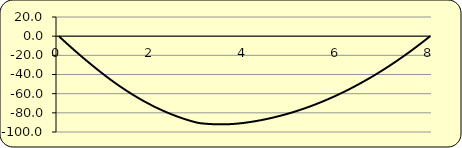
| Category | moment |
|---|---|
| 0.0 | 0 |
| 0.08 | -3.597 |
| 0.16 | -7.141 |
| 0.24 | -10.634 |
| 0.32 | -14.074 |
| 0.4 | -17.463 |
| 0.48000000000000004 | -20.8 |
| 0.56 | -24.085 |
| 0.64 | -27.318 |
| 0.72 | -30.499 |
| 0.7999999999999999 | -33.628 |
| 0.8799999999999999 | -36.706 |
| 0.9599999999999999 | -39.731 |
| 1.0399999999999998 | -42.701 |
| 1.1199999999999999 | -45.594 |
| 1.2 | -48.407 |
| 1.28 | -51.14 |
| 1.36 | -53.793 |
| 1.4400000000000002 | -56.366 |
| 1.5200000000000002 | -58.859 |
| 1.6000000000000003 | -61.272 |
| 1.6800000000000004 | -63.604 |
| 1.7600000000000005 | -65.857 |
| 1.8400000000000005 | -68.029 |
| 1.9200000000000006 | -70.122 |
| 2.0000000000000004 | -72.134 |
| 2.0800000000000005 | -74.066 |
| 2.1600000000000006 | -75.918 |
| 2.2400000000000007 | -77.69 |
| 2.3200000000000007 | -79.382 |
| 2.400000000000001 | -80.994 |
| 2.480000000000001 | -82.526 |
| 2.560000000000001 | -83.977 |
| 2.640000000000001 | -85.349 |
| 2.720000000000001 | -86.641 |
| 2.800000000000001 | -87.852 |
| 2.8800000000000012 | -88.983 |
| 2.9600000000000013 | -90.034 |
| 3.0400000000000014 | -90.766 |
| 3.1200000000000014 | -91.177 |
| 3.2000000000000015 | -91.508 |
| 3.2800000000000016 | -91.758 |
| 3.3600000000000017 | -91.929 |
| 3.4400000000000017 | -92.02 |
| 3.520000000000002 | -92.03 |
| 3.600000000000002 | -91.961 |
| 3.680000000000002 | -91.811 |
| 3.760000000000002 | -91.582 |
| 3.840000000000002 | -91.272 |
| 3.920000000000002 | -90.882 |
| 4.000000000000002 | -90.412 |
| 4.080000000000002 | -89.876 |
| 4.160000000000002 | -89.288 |
| 4.240000000000002 | -88.648 |
| 4.320000000000002 | -87.957 |
| 4.400000000000002 | -87.213 |
| 4.480000000000002 | -86.417 |
| 4.560000000000002 | -85.57 |
| 4.640000000000002 | -84.67 |
| 4.720000000000002 | -83.719 |
| 4.8000000000000025 | -82.716 |
| 4.880000000000003 | -81.66 |
| 4.960000000000003 | -80.553 |
| 5.040000000000003 | -79.394 |
| 5.120000000000003 | -78.183 |
| 5.200000000000003 | -76.92 |
| 5.280000000000003 | -75.605 |
| 5.360000000000003 | -74.238 |
| 5.440000000000003 | -72.819 |
| 5.520000000000003 | -71.349 |
| 5.600000000000003 | -69.826 |
| 5.680000000000003 | -68.252 |
| 5.760000000000003 | -66.625 |
| 5.840000000000003 | -64.947 |
| 5.9200000000000035 | -63.216 |
| 6.0000000000000036 | -61.434 |
| 6.080000000000004 | -59.6 |
| 6.160000000000004 | -57.714 |
| 6.240000000000004 | -55.776 |
| 6.320000000000004 | -53.786 |
| 6.400000000000004 | -51.744 |
| 6.480000000000004 | -49.65 |
| 6.560000000000004 | -47.504 |
| 6.640000000000004 | -45.306 |
| 6.720000000000004 | -43.057 |
| 6.800000000000004 | -40.755 |
| 6.880000000000004 | -38.402 |
| 6.960000000000004 | -35.996 |
| 7.0400000000000045 | -33.539 |
| 7.1200000000000045 | -31.03 |
| 7.200000000000005 | -28.468 |
| 7.280000000000005 | -25.855 |
| 7.360000000000005 | -23.19 |
| 7.440000000000005 | -20.473 |
| 7.520000000000005 | -17.704 |
| 7.600000000000005 | -14.883 |
| 7.680000000000005 | -12.01 |
| 7.760000000000005 | -9.086 |
| 7.840000000000005 | -6.109 |
| 7.920000000000005 | -3.081 |
| 8.000000000000005 | 0 |